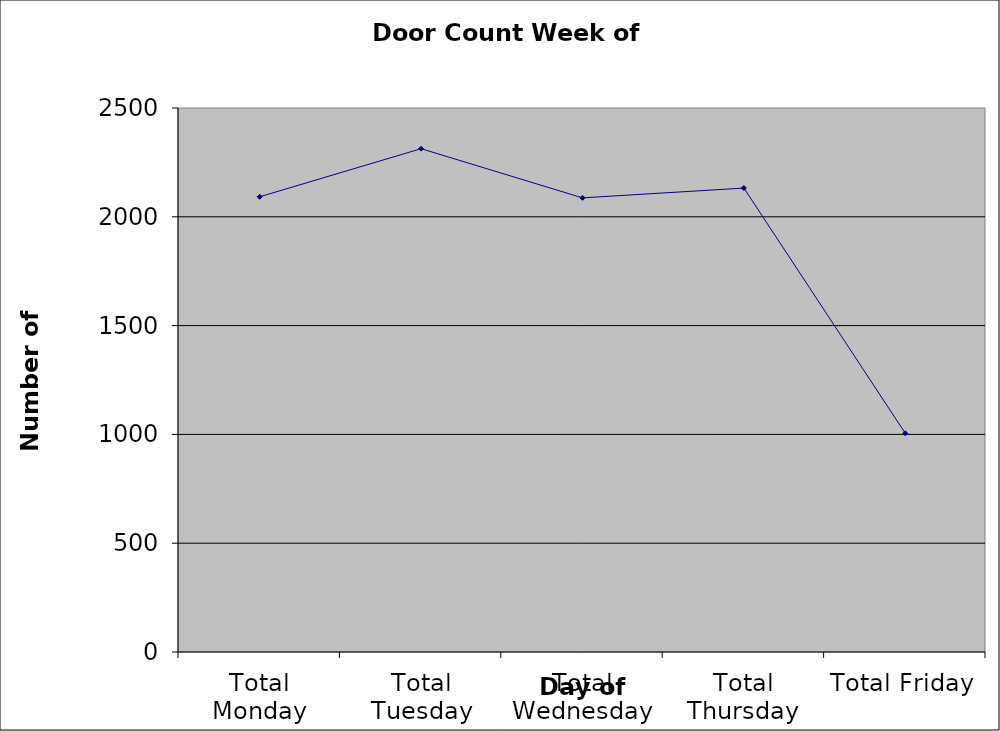
| Category | Series 0 |
|---|---|
| Total Monday | 2092 |
| Total Tuesday | 2313 |
| Total Wednesday | 2087 |
| Total Thursday | 2132 |
| Total Friday | 1005 |